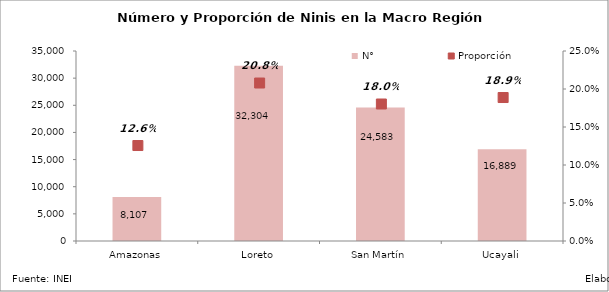
| Category | N° |
|---|---|
| Amazonas | 8106.84 |
| Loreto | 32304.02 |
| San Martín | 24583.34 |
| Ucayali | 16889.3 |